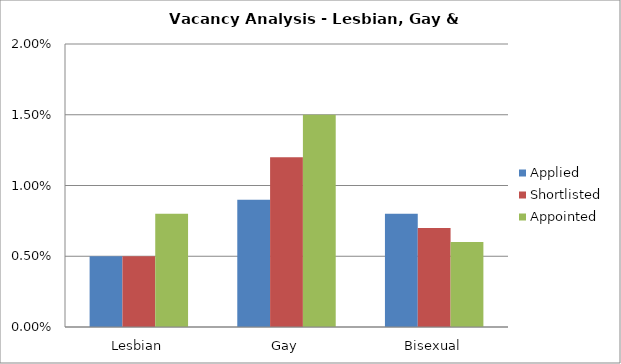
| Category | Applied | Shortlisted | Appointed |
|---|---|---|---|
| Lesbian | 0.005 | 0.005 | 0.008 |
| Gay | 0.009 | 0.012 | 0.015 |
| Bisexual | 0.008 | 0.007 | 0.006 |